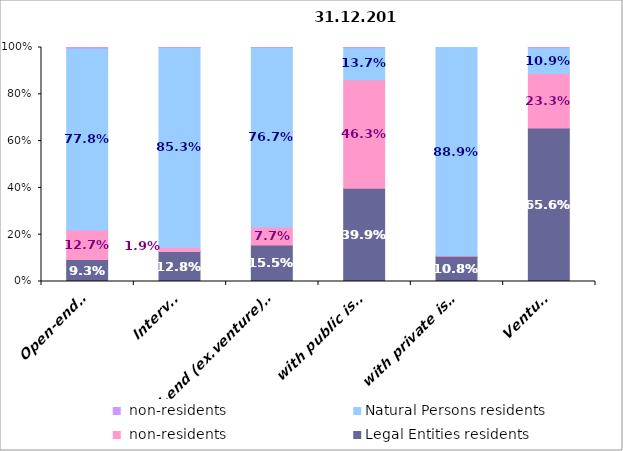
| Category | Legal Entities residents | Legal Entities non-residents | Natural Persons residents | Natural Persons non-residents |
|---|---|---|---|---|
| Open-ended | 0.093 | 0.127 | 0.778 | 0.002 |
| Interval | 0.128 | 0.019 | 0.853 | 0 |
| Closed-end (ex.venture), incl.: | 0.155 | 0.077 | 0.767 | 0 |
| with public issue | 0.399 | 0.463 | 0.137 | 0.001 |
| with private issue | 0.108 | 0.003 | 0.889 | 0 |
| Venture | 0.656 | 0.233 | 0.109 | 0.001 |